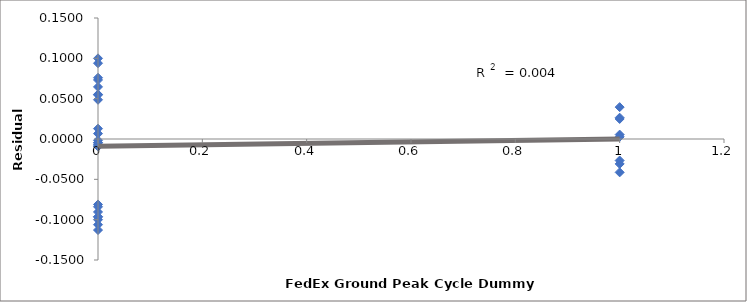
| Category | Series 0 |
|---|---|
| 0.0 | -0.007 |
| 1.0 | 0.04 |
| 0.0 | 0.055 |
| 0.0 | -0.081 |
| 0.0 | -0.005 |
| 1.0 | 0.003 |
| 0.0 | 0.055 |
| 0.0 | -0.084 |
| 0.0 | 0.007 |
| 1.0 | 0.026 |
| 0.0 | 0.1 |
| 0.0 | -0.09 |
| 0.0 | 0.013 |
| 1.0 | -0.041 |
| 0.0 | 0.073 |
| 0.0 | -0.113 |
| 0.0 | -0.009 |
| 1.0 | -0.031 |
| 0.0 | 0.076 |
| 0.0 | -0.1 |
| 0.0 | -0.004 |
| 1.0 | 0.025 |
| 0.0 | 0.094 |
| 0.0 | -0.106 |
| 0.0 | -0.009 |
| 1.0 | -0.027 |
| 0.0 | 0.065 |
| 0.0 | -0.096 |
| 0.0 | -0.002 |
| 1.0 | 0.005 |
| 0.0 | 0.049 |
| 0.0 | -0.097 |